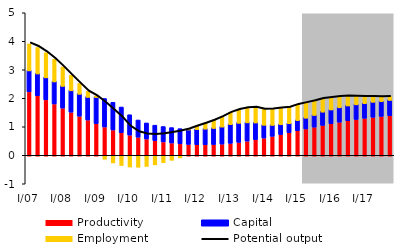
| Category | Productivity | Capital | Employment |
|---|---|---|---|
| I/07 | 2.226 | 0.766 | 0.934 |
| II | 2.088 | 0.795 | 0.917 |
| III | 1.946 | 0.803 | 0.867 |
| IV | 1.801 | 0.803 | 0.784 |
| I/08 | 1.656 | 0.79 | 0.669 |
| II | 1.512 | 0.781 | 0.529 |
| III | 1.372 | 0.796 | 0.369 |
| IV | 1.237 | 0.823 | 0.202 |
| I/09 | 1.11 | 0.947 | 0.04 |
| II | 0.993 | 0.999 | -0.11 |
| III | 0.887 | 0.973 | -0.236 |
| IV | 0.792 | 0.902 | -0.328 |
| I/10 | 0.708 | 0.714 | -0.382 |
| II | 0.635 | 0.604 | -0.39 |
| III | 0.571 | 0.564 | -0.36 |
| IV | 0.516 | 0.541 | -0.303 |
| I/11 | 0.469 | 0.54 | -0.229 |
| II | 0.431 | 0.541 | -0.146 |
| III | 0.402 | 0.533 | -0.059 |
| IV | 0.381 | 0.536 | 0.029 |
| I/12 | 0.37 | 0.562 | 0.116 |
| II | 0.367 | 0.577 | 0.201 |
| III | 0.375 | 0.595 | 0.281 |
| IV | 0.392 | 0.627 | 0.355 |
| I/13 | 0.418 | 0.686 | 0.421 |
| II | 0.454 | 0.696 | 0.474 |
| III | 0.497 | 0.672 | 0.512 |
| IV | 0.548 | 0.614 | 0.537 |
| I/14 | 0.604 | 0.477 | 0.553 |
| II | 0.664 | 0.412 | 0.563 |
| III | 0.728 | 0.375 | 0.569 |
| IV | 0.793 | 0.345 | 0.566 |
| I/15 | 0.859 | 0.387 | 0.554 |
| II | 0.924 | 0.406 | 0.532 |
| III | 0.988 | 0.438 | 0.501 |
| IV | 1.049 | 0.494 | 0.462 |
| I/16 | 1.107 | 0.513 | 0.419 |
| II | 1.161 | 0.536 | 0.374 |
| III | 1.211 | 0.55 | 0.328 |
| IV | 1.257 | 0.545 | 0.28 |
| I/17 | 1.298 | 0.543 | 0.234 |
| II | 1.334 | 0.555 | 0.191 |
| III | 1.365 | 0.549 | 0.154 |
| IV | 1.391 | 0.562 | 0.124 |